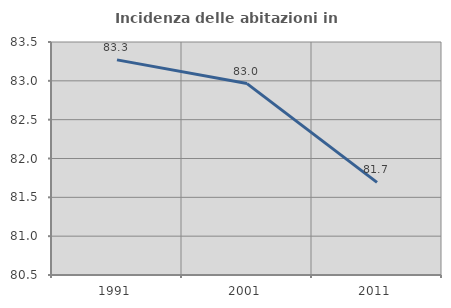
| Category | Incidenza delle abitazioni in proprietà  |
|---|---|
| 1991.0 | 83.27 |
| 2001.0 | 82.964 |
| 2011.0 | 81.692 |